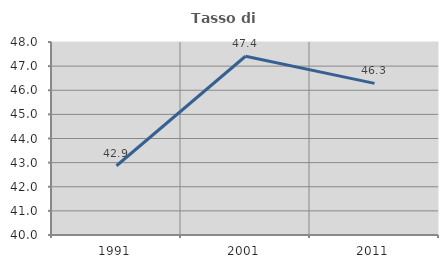
| Category | Tasso di occupazione   |
|---|---|
| 1991.0 | 42.87 |
| 2001.0 | 47.41 |
| 2011.0 | 46.285 |